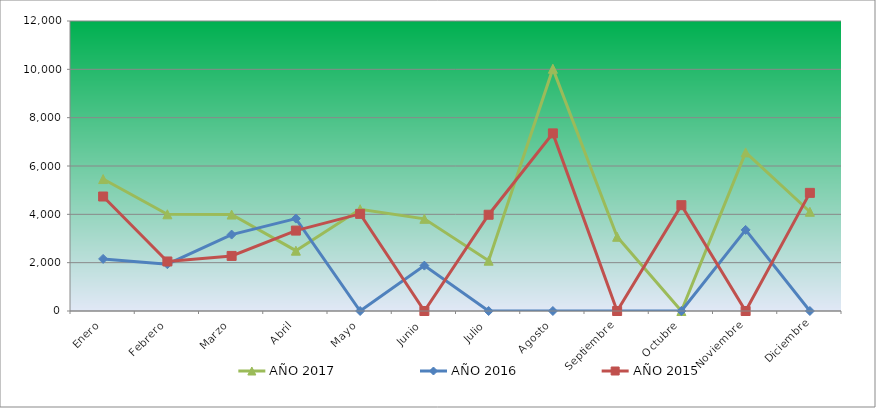
| Category | AÑO 2017 | AÑO 2016 | AÑO 2015 |
|---|---|---|---|
| Enero | 5459.889 | 2156.473 | 4737.423 |
| Febrero | 4001.251 | 1936.188 | 2048.935 |
| Marzo | 3990.776 | 3161.64 | 2279.028 |
| Abril | 2495.947 | 3823.887 | 3327.419 |
| Mayo | 4210.74 | 0 | 4019.951 |
| Junio | 3813.522 | 1878.218 | 0 |
| Julio | 2080.917 | 0 | 3983.215 |
| Agosto | 10023.867 | 0 | 7349.703 |
| Septiembre | 3071.282 | 0 | 0 |
| Octubre | 0 | 0 | 4378.687 |
| Noviembre | 6563.006 | 3356.445 | 0 |
| Diciembre | 4105.995 | 0 | 4888.194 |